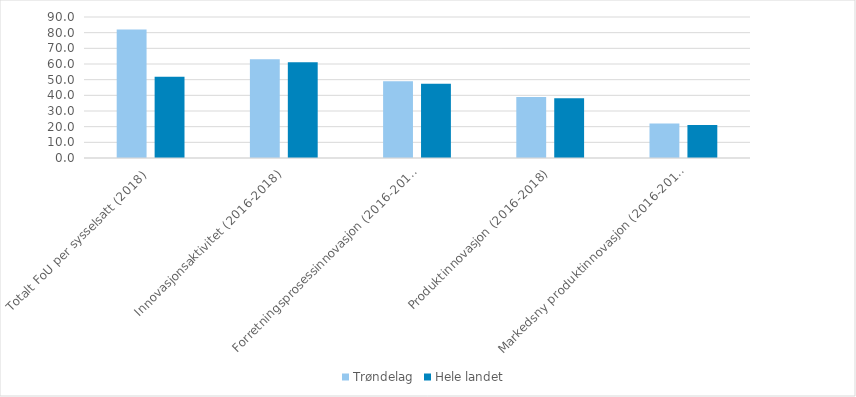
| Category | Trøndelag | Hele landet  |
|---|---|---|
| Totalt FoU per sysselsatt (2018) | 81.974 | 51.82 |
| Innovasjonsaktivitet (2016-2018) | 63 | 61.147 |
| Forretningsprosessinnovasjon (2016-2018) | 49 | 47.427 |
| Produktinnovasjon (2016-2018) | 39 | 38.209 |
| Markedsny produktinnovasjon (2016-2018) | 22.056 | 21.052 |